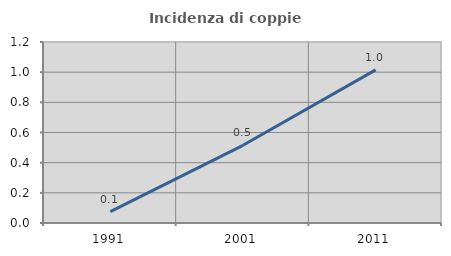
| Category | Incidenza di coppie miste |
|---|---|
| 1991.0 | 0.076 |
| 2001.0 | 0.515 |
| 2011.0 | 1.015 |